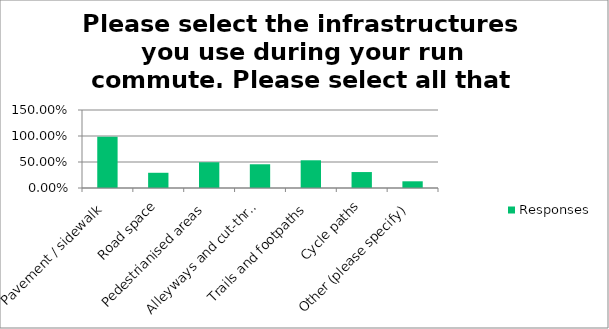
| Category | Responses |
|---|---|
| Pavement / sidewalk | 0.986 |
| Road space | 0.293 |
| Pedestrianised areas | 0.495 |
| Alleyways and cut-throughs | 0.456 |
| Trails and footpaths | 0.533 |
| Cycle paths | 0.307 |
| Other (please specify) | 0.129 |